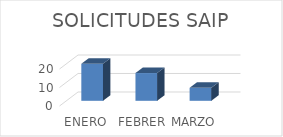
| Category | Series 0 |
|---|---|
| ENERO | 20 |
| FEBRERO | 15 |
| MARZO | 7 |